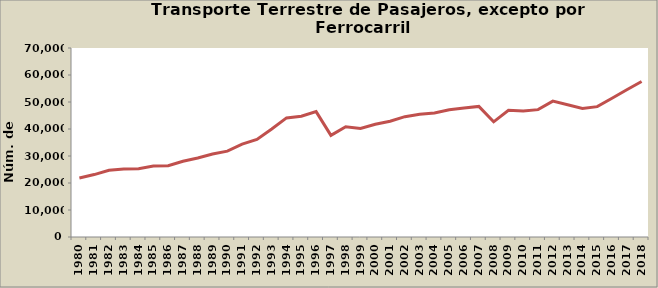
| Category | Series 0 |
|---|---|
| 1980.0 | 21840 |
| 1981.0 | 23120 |
| 1982.0 | 24701 |
| 1983.0 | 25225 |
| 1984.0 | 25268 |
| 1985.0 | 26316 |
| 1986.0 | 26382 |
| 1987.0 | 28073 |
| 1988.0 | 29279 |
| 1989.0 | 30735 |
| 1990.0 | 31811 |
| 1991.0 | 34380 |
| 1992.0 | 36140 |
| 1993.0 | 39997 |
| 1994.0 | 44109 |
| 1995.0 | 44711 |
| 1996.0 | 46427 |
| 1997.0 | 37643 |
| 1998.0 | 40846 |
| 1999.0 | 40197 |
| 2000.0 | 41758 |
| 2001.0 | 42899 |
| 2002.0 | 44573 |
| 2003.0 | 45485 |
| 2004.0 | 45906 |
| 2005.0 | 47092 |
| 2006.0 | 47751 |
| 2007.0 | 48374 |
| 2008.0 | 42648 |
| 2009.0 | 46948 |
| 2010.0 | 46658 |
| 2011.0 | 47172 |
| 2012.0 | 50312 |
| 2013.0 | 48981 |
| 2014.0 | 47610 |
| 2015.0 | 48287 |
| 2016.0 | 51371 |
| 2017.0 | 54531 |
| 2018.0 | 57599 |